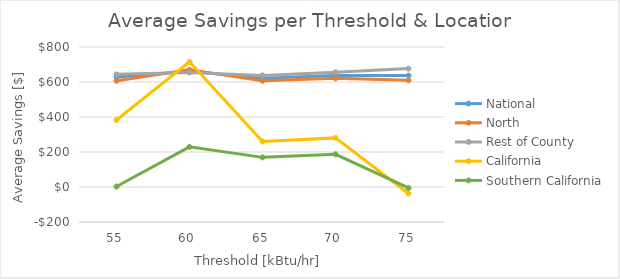
| Category | National | North | Rest of County | California | Southern California |
|---|---|---|---|---|---|
| 55.0 | 628.759 | 607.08 | 643.619 | 382.93 | 2.675 |
| 60.0 | 661.729 | 669.403 | 654.361 | 715.16 | 229.315 |
| 65.0 | 621.408 | 607.082 | 637.761 | 260.085 | 169.348 |
| 70.0 | 637.076 | 620.757 | 655.816 | 280.64 | 186.905 |
| 75.0 | 636.752 | 609.591 | 676.557 | -37.291 | -5.34 |